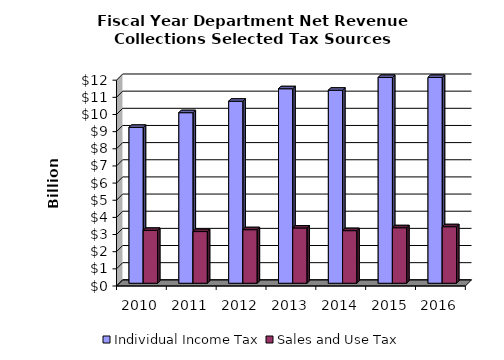
| Category | Individual Income Tax | Sales and Use Tax |
|---|---|---|
| 2010.0 | 9.088 | 3.083 |
| 2011.0 | 9.944 | 3.012 |
| 2012.0 | 10.613 | 3.122 |
| 2013.0 | 11.34 | 3.22 |
| 2014.0 | 11.253 | 3.066 |
| 2015.0 | 12.329 | 3.235 |
| 2016.0 | 12.556 | 3.296 |